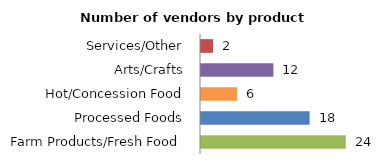
| Category | Series 0 |
|---|---|
| Farm Products/Fresh Food | 24 |
| Processed Foods | 18 |
| Hot/Concession Food | 6 |
| Arts/Crafts | 12 |
| Services/Other | 2 |